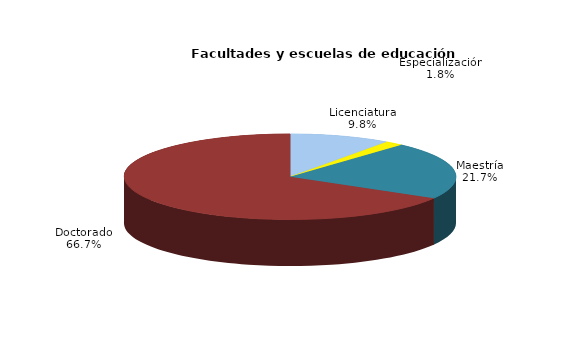
| Category | Series 0 |
|---|---|
| Licenciatura | 410 |
| Especialización | 75 |
| Maestría | 905 |
| Doctorado | 2778 |